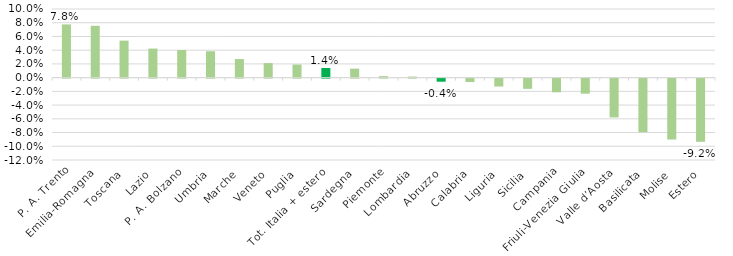
| Category | Series 0 |
|---|---|
| P. A. Trento | 0.078 |
| Emilia-Romagna | 0.076 |
| Toscana | 0.054 |
| Lazio | 0.042 |
| P. A. Bolzano | 0.04 |
| Umbria | 0.038 |
| Marche | 0.027 |
| Veneto | 0.021 |
| Puglia | 0.019 |
| Tot. Italia + estero | 0.014 |
| Sardegna | 0.013 |
| Piemonte | 0.002 |
| Lombardia | 0.002 |
| Abruzzo | -0.004 |
| Calabria | -0.005 |
| Liguria | -0.011 |
| Sicilia | -0.015 |
| Campania | -0.02 |
| Friuli-Venezia Giulia | -0.022 |
| Valle d’Aosta | -0.057 |
| Basilicata | -0.078 |
| Molise | -0.089 |
| Estero | -0.092 |